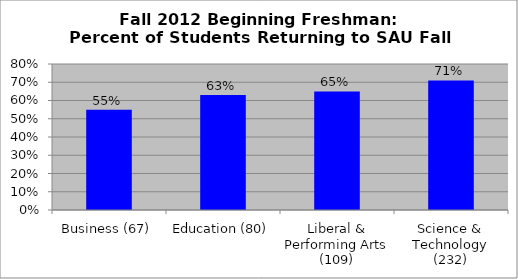
| Category | Series 0 |
|---|---|
| Business (67) | 0.55 |
| Education (80) | 0.63 |
| Liberal & Performing Arts (109) | 0.65 |
| Science & Technology (232) | 0.71 |